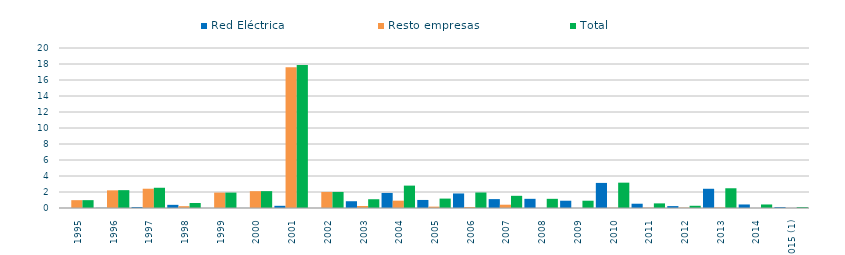
| Category | Red Eléctrica | Resto empresas | Total |
|---|---|---|---|
| 1995 | 0.002 | 0.979 | 0.981 |
| 1996 | 0.024 | 2.206 | 2.23 |
| 1997 | 0.12 | 2.41 | 2.53 |
| 1998 | 0.395 | 0.227 | 0.622 |
| 1999 | 0.001 | 1.926 | 1.927 |
| 2000 | 0.004 | 2.103 | 2.107 |
| 2001 | 0.274 | 17.594 | 17.868 |
| 2002 | 0 | 2.006 | 2.006 |
| 2003 | 0.846 | 0.249 | 1.095 |
| 2004 | 1.882 | 0.916 | 2.798 |
| 2005 | 1.006 | 0.17 | 1.176 |
| 2006 | 1.817 | 0.122 | 1.939 |
| 2007 | 1.111 | 0.412 | 1.523 |
| 2008 | 1.147 | 0 | 1.147 |
| 2009 | 0.91 | 0 | 0.91 |
| 2010 | 3.135 | 0.032 | 3.167 |
| 2011 | 0.535 | 0.042 | 0.577 |
| 2012 | 0.238 | 0.04 | 0.278 |
| 2013 | 2.403 | 0.064 | 2.467 |
| 2014 | 0.441 | 0 | 0.441 |
| 2015 (1) | 0.112 | 0 | 0.112 |